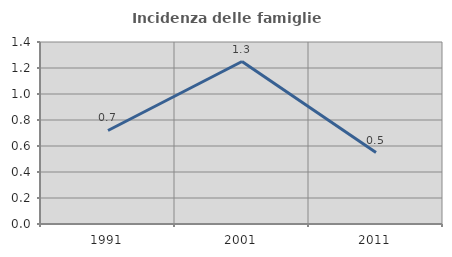
| Category | Incidenza delle famiglie numerose |
|---|---|
| 1991.0 | 0.719 |
| 2001.0 | 1.25 |
| 2011.0 | 0.549 |